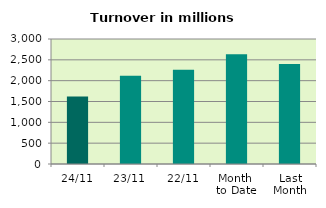
| Category | Series 0 |
|---|---|
| 24/11 | 1619.933 |
| 23/11 | 2120.938 |
| 22/11 | 2259.702 |
| Month 
to Date | 2632.755 |
| Last
Month | 2399.244 |